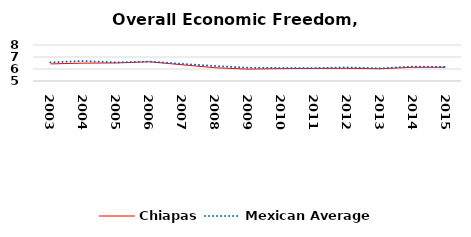
| Category | Chiapas | Mexican Average  |
|---|---|---|
| 2003.0 | 6.425 | 6.552 |
| 2004.0 | 6.488 | 6.668 |
| 2005.0 | 6.505 | 6.546 |
| 2006.0 | 6.604 | 6.619 |
| 2007.0 | 6.354 | 6.428 |
| 2008.0 | 6.103 | 6.248 |
| 2009.0 | 5.991 | 6.106 |
| 2010.0 | 6.031 | 6.086 |
| 2011.0 | 6.049 | 6.074 |
| 2012.0 | 6.057 | 6.134 |
| 2013.0 | 6.022 | 6.054 |
| 2014.0 | 6.141 | 6.2 |
| 2015.0 | 6.145 | 6.174 |